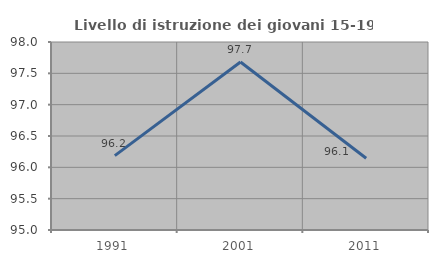
| Category | Livello di istruzione dei giovani 15-19 anni |
|---|---|
| 1991.0 | 96.186 |
| 2001.0 | 97.681 |
| 2011.0 | 96.144 |